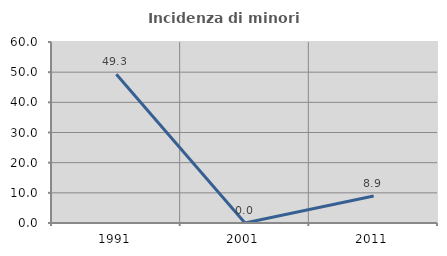
| Category | Incidenza di minori stranieri |
|---|---|
| 1991.0 | 49.275 |
| 2001.0 | 0 |
| 2011.0 | 8.929 |